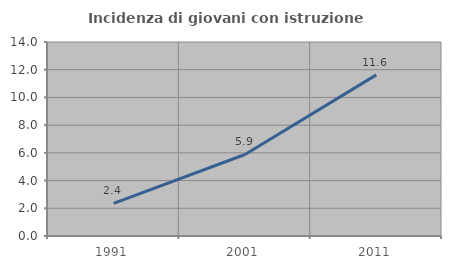
| Category | Incidenza di giovani con istruzione universitaria |
|---|---|
| 1991.0 | 2.353 |
| 2001.0 | 5.882 |
| 2011.0 | 11.628 |